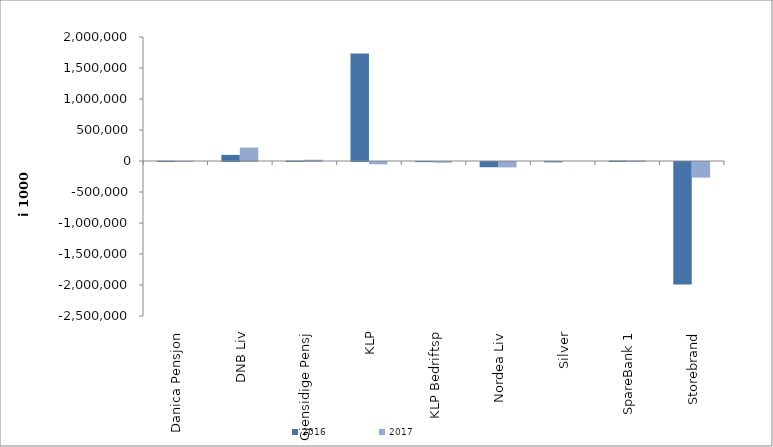
| Category | 2016 | 2017 |
|---|---|---|
| 0 | 3164.315 | 3232.74 |
| 1 | 98448 | 217490 |
| 2 | 5465.622 | 20501 |
| 3 | 1734144.823 | -36647.545 |
| 4 | -1716 | -11503 |
| 5 | -84367.383 | -87133.885 |
| 6 | -4800.856 | 0 |
| 7 | 6068.083 | 8216.9 |
| 8 | -1973854.843 | -251182.724 |